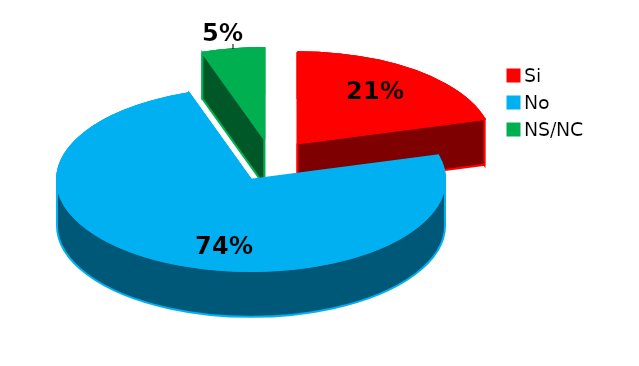
| Category | Series 0 |
|---|---|
| Si | 24 |
| No | 86 |
| NS/NC | 6 |